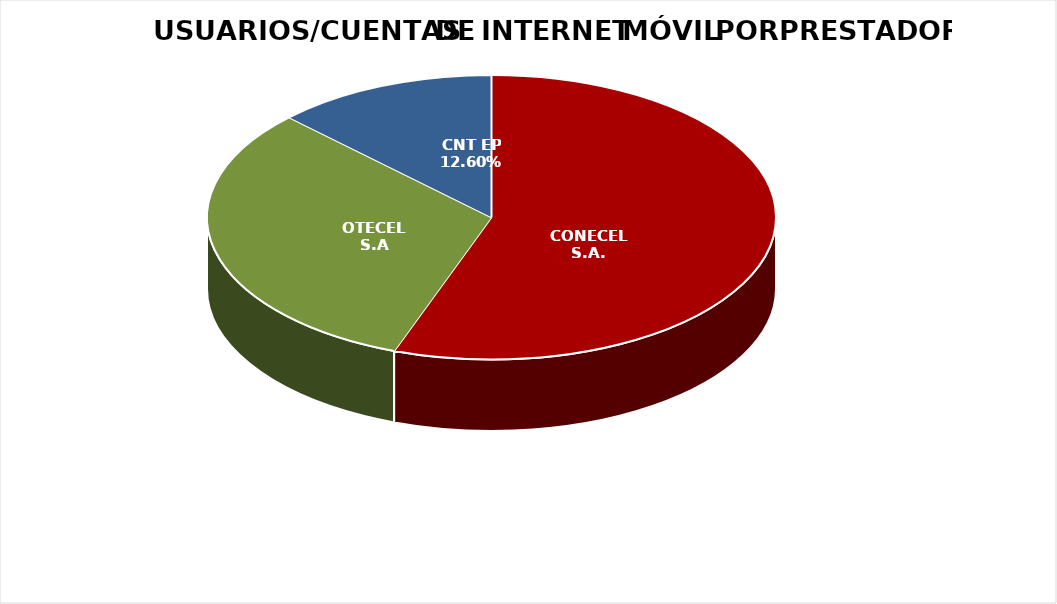
| Category | Series 0 | Series 1 |
|---|---|---|
| CONECEL S.A. | 5751495 | 0.556 |
| OTECEL S.A | 3296452.746 | 0.318 |
| CNT EP | 1304579 | 0.126 |